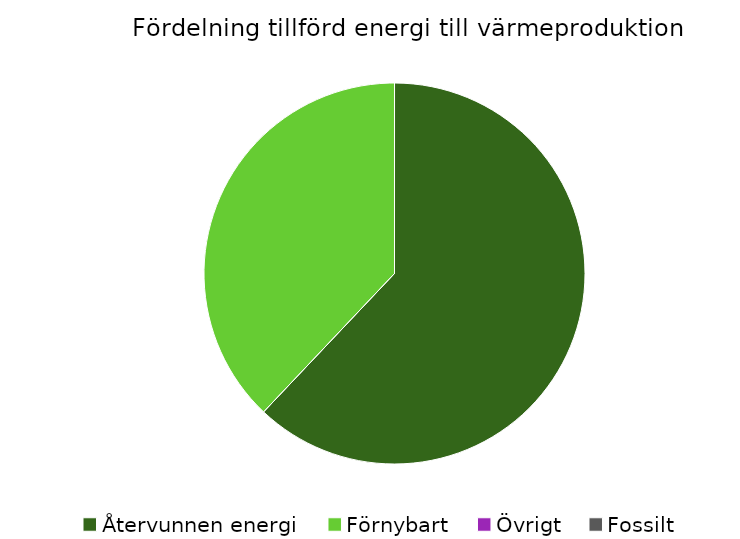
| Category | Fördelning värmeproduktion |
|---|---|
| Återvunnen energi | 0.621 |
| Förnybart | 0.379 |
| Övrigt | 0 |
| Fossilt | 0 |